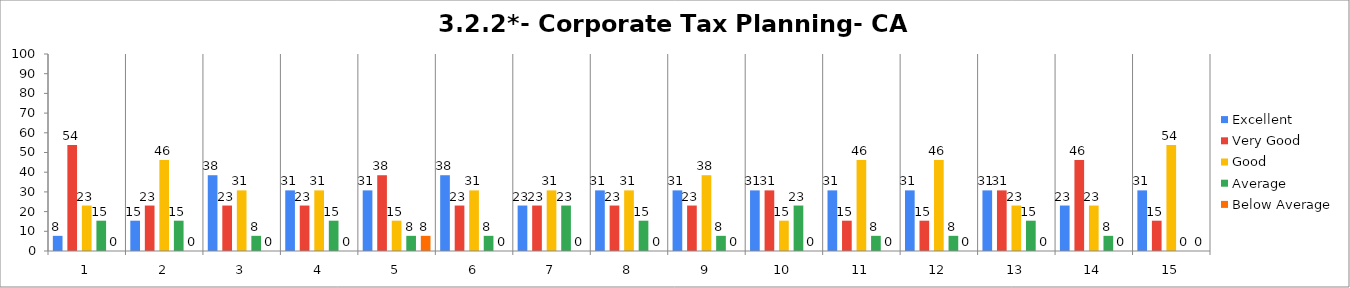
| Category | Excellent | Very Good | Good | Average | Below Average |
|---|---|---|---|---|---|
| 0 | 7.692 | 53.846 | 23.077 | 15.385 | 0 |
| 1 | 15.385 | 23.077 | 46.154 | 15.385 | 0 |
| 2 | 38.462 | 23.077 | 30.769 | 7.692 | 0 |
| 3 | 30.769 | 23.077 | 30.769 | 15.385 | 0 |
| 4 | 30.769 | 38.462 | 15.385 | 7.692 | 7.692 |
| 5 | 38.462 | 23.077 | 30.769 | 7.692 | 0 |
| 6 | 23.077 | 23.077 | 30.769 | 23.077 | 0 |
| 7 | 30.769 | 23.077 | 30.769 | 15.385 | 0 |
| 8 | 30.769 | 23.077 | 38.462 | 7.692 | 0 |
| 9 | 30.769 | 30.769 | 15.385 | 23.077 | 0 |
| 10 | 30.769 | 15.385 | 46.154 | 7.692 | 0 |
| 11 | 30.769 | 15.385 | 46.154 | 7.692 | 0 |
| 12 | 30.769 | 30.769 | 23.077 | 15.385 | 0 |
| 13 | 23.077 | 46.154 | 23.077 | 7.692 | 0 |
| 14 | 30.769 | 15.385 | 53.846 | 0 | 0 |